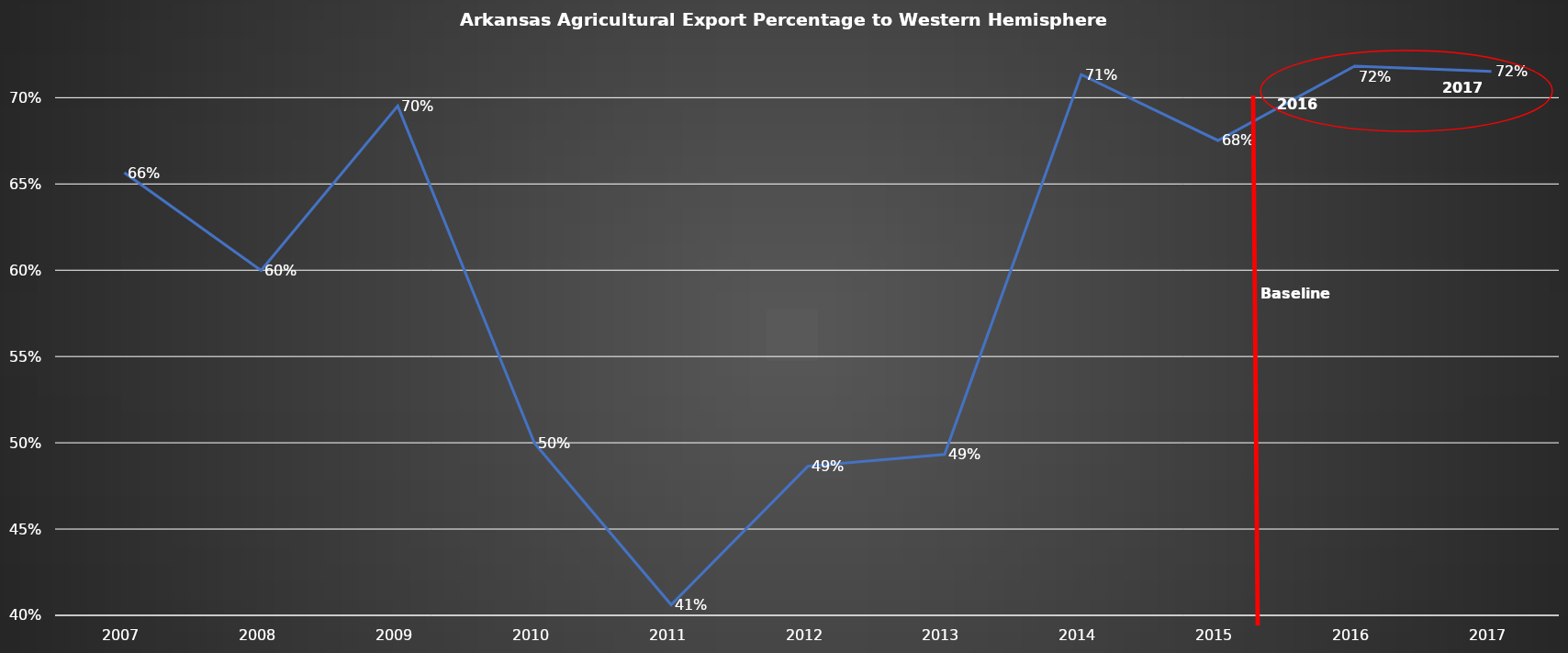
| Category | Series 0 |
|---|---|
| 2007.0 | 0.657 |
| 2008.0 | 0.6 |
| 2009.0 | 0.695 |
| 2010.0 | 0.5 |
| 2011.0 | 0.406 |
| 2012.0 | 0.486 |
| 2013.0 | 0.493 |
| 2014.0 | 0.713 |
| 2015.0 | 0.675 |
| 2016.0 | 0.718 |
| 2017.0 | 0.715 |